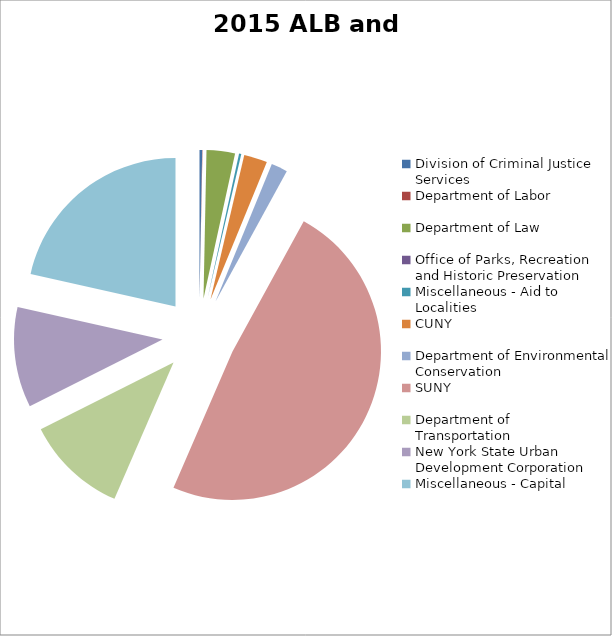
| Category | Series 0 |
|---|---|
| Division of Criminal Justice Services | 7634000 |
| Department of Labor | 865000 |
| Department of Law | 81500234 |
| Office of Parks, Recreation and Historic Preservation | 58900 |
| Miscellaneous - Aid to Localities | 6280000 |
| CUNY | 67000000 |
| Department of Environmental Conservation | 46741000 |
| SUNY | 1280109000 |
| Department of Transportation | 292356000 |
| New York State Urban Development Corporation | 287808000 |
| Miscellaneous - Capital | 566802000 |